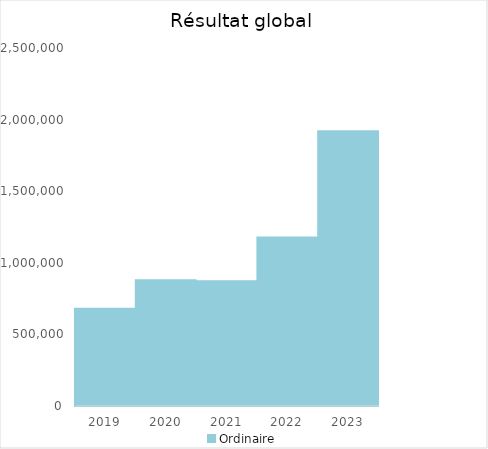
| Category |   | Ordinaire |    |
|---|---|---|---|
| 2019.0 |  | 678967.06 |  |
| 2020.0 |  | 878465.29 |  |
| 2021.0 |  | 870956.61 |  |
| 2022.0 |  | 1176319.99 |  |
| 2023.0 |  | 1919086.79 |  |